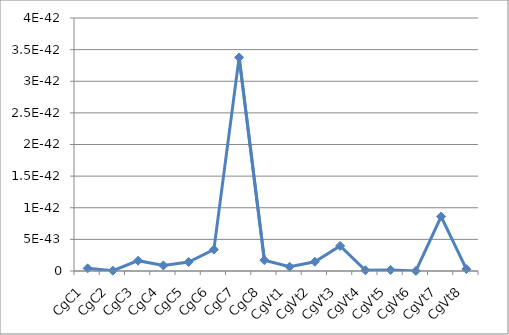
| Category | Series 0 |
|---|---|
| CgC1 | 0 |
| CgC2 | 0 |
| CgC3 | 0 |
| CgC4 | 0 |
| CgC5 | 0 |
| CgC6 | 0 |
| CgC7 | 0 |
| CgC8 | 0 |
| CgVt1 | 0 |
| CgVt2 | 0 |
| CgVt3 | 0 |
| CgVt4 | 0 |
| CgVt5 | 0 |
| CgVt6 | 0 |
| CgVt7 | 0 |
| CgVt8 | 0 |